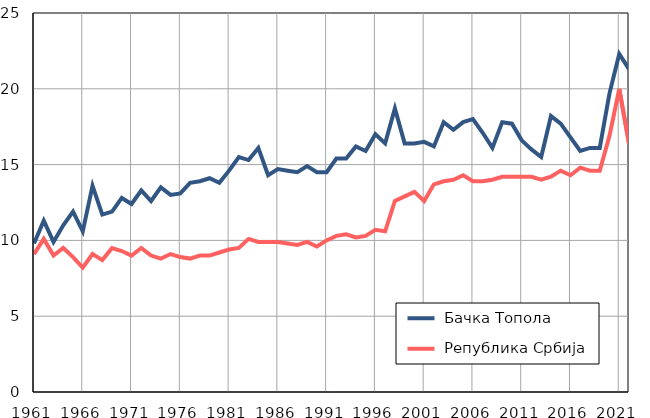
| Category |  Бачка Топола |  Република Србија |
|---|---|---|
| 1961.0 | 9.8 | 9.1 |
| 1962.0 | 11.3 | 10.1 |
| 1963.0 | 9.9 | 9 |
| 1964.0 | 11 | 9.5 |
| 1965.0 | 11.9 | 8.9 |
| 1966.0 | 10.6 | 8.2 |
| 1967.0 | 13.6 | 9.1 |
| 1968.0 | 11.7 | 8.7 |
| 1969.0 | 11.9 | 9.5 |
| 1970.0 | 12.8 | 9.3 |
| 1971.0 | 12.4 | 9 |
| 1972.0 | 13.3 | 9.5 |
| 1973.0 | 12.6 | 9 |
| 1974.0 | 13.5 | 8.8 |
| 1975.0 | 13 | 9.1 |
| 1976.0 | 13.1 | 8.9 |
| 1977.0 | 13.8 | 8.8 |
| 1978.0 | 13.9 | 9 |
| 1979.0 | 14.1 | 9 |
| 1980.0 | 13.8 | 9.2 |
| 1981.0 | 14.6 | 9.4 |
| 1982.0 | 15.5 | 9.5 |
| 1983.0 | 15.3 | 10.1 |
| 1984.0 | 16.1 | 9.9 |
| 1985.0 | 14.3 | 9.9 |
| 1986.0 | 14.7 | 9.9 |
| 1987.0 | 14.6 | 9.8 |
| 1988.0 | 14.5 | 9.7 |
| 1989.0 | 14.9 | 9.9 |
| 1990.0 | 14.5 | 9.6 |
| 1991.0 | 14.5 | 10 |
| 1992.0 | 15.4 | 10.3 |
| 1993.0 | 15.4 | 10.4 |
| 1994.0 | 16.2 | 10.2 |
| 1995.0 | 15.9 | 10.3 |
| 1996.0 | 17 | 10.7 |
| 1997.0 | 16.4 | 10.6 |
| 1998.0 | 18.7 | 12.6 |
| 1999.0 | 16.4 | 12.9 |
| 2000.0 | 16.4 | 13.2 |
| 2001.0 | 16.5 | 12.6 |
| 2002.0 | 16.2 | 13.7 |
| 2003.0 | 17.8 | 13.9 |
| 2004.0 | 17.3 | 14 |
| 2005.0 | 17.8 | 14.3 |
| 2006.0 | 18 | 13.9 |
| 2007.0 | 17.1 | 13.9 |
| 2008.0 | 16.1 | 14 |
| 2009.0 | 17.8 | 14.2 |
| 2010.0 | 17.7 | 14.2 |
| 2011.0 | 16.6 | 14.2 |
| 2012.0 | 16 | 14.2 |
| 2013.0 | 15.5 | 14 |
| 2014.0 | 18.2 | 14.2 |
| 2015.0 | 17.7 | 14.6 |
| 2016.0 | 16.8 | 14.3 |
| 2017.0 | 15.9 | 14.8 |
| 2018.0 | 16.1 | 14.6 |
| 2019.0 | 16.1 | 14.6 |
| 2020.0 | 19.7 | 16.9 |
| 2021.0 | 22.3 | 20 |
| 2022.0 | 21.3 | 16.4 |